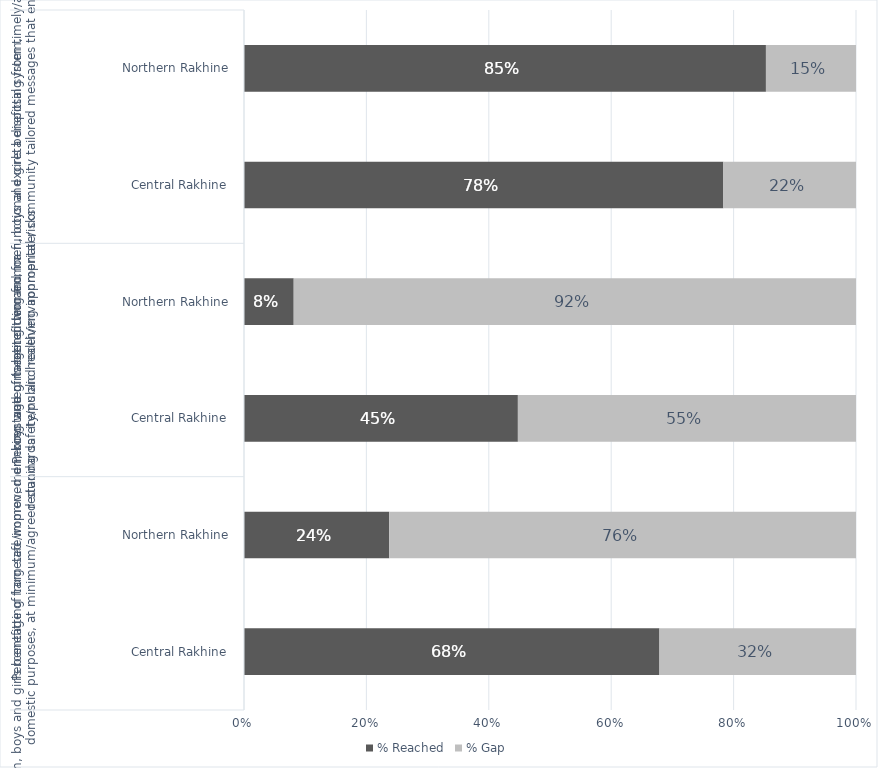
| Category | % Reached | % Gap |
|---|---|---|
| 0 | 0.679 | 0.321 |
| 1 | 0.237 | 0.763 |
| 2 | 0.448 | 0.552 |
| 3 | 0.081 | 0.919 |
| 4 | 0.783 | 0.217 |
| 5 | 0.853 | 0.147 |